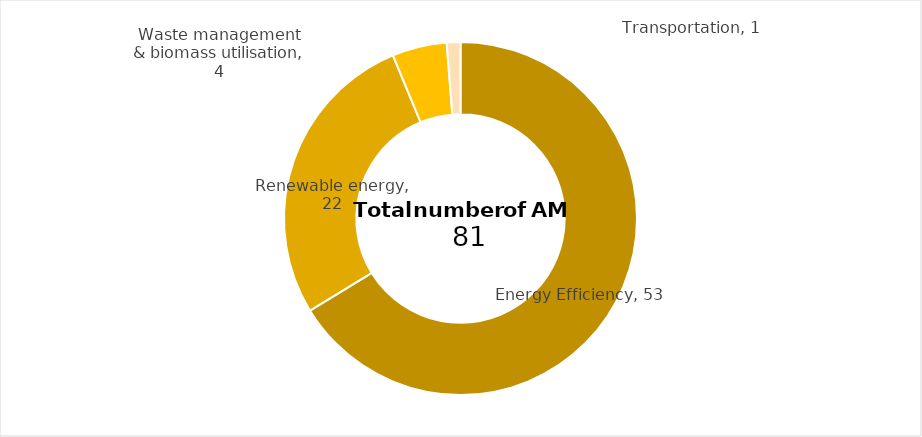
| Category | Series 0 |
|---|---|
| 0 | 53 |
| 1 | 22 |
| 2 | 4 |
| 3 | 1 |